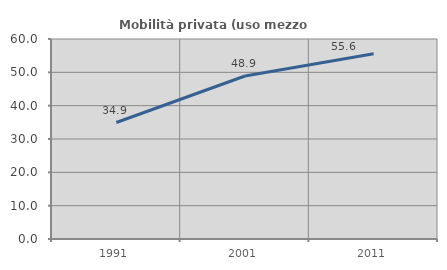
| Category | Mobilità privata (uso mezzo privato) |
|---|---|
| 1991.0 | 34.947 |
| 2001.0 | 48.892 |
| 2011.0 | 55.59 |